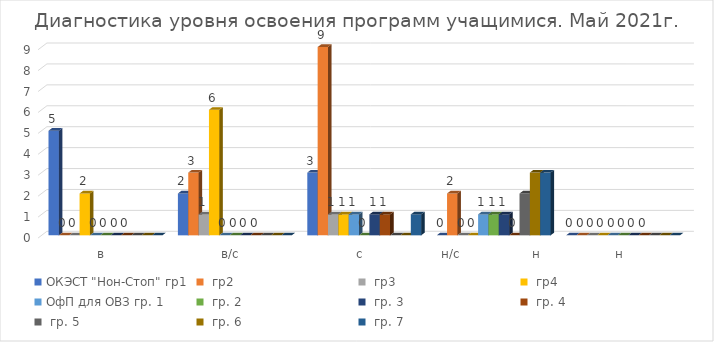
| Category | ОКЭСТ "Нон-Стоп" | ОфП для ОВЗ |
|---|---|---|
| в | 2 | 0 |
| в/с | 6 | 0 |
| с | 1 | 1 |
| н/с                  н | 0 | 3 |
| н | 0 | 0 |